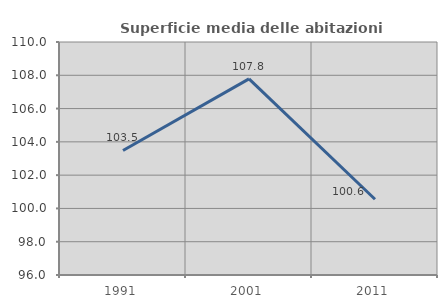
| Category | Superficie media delle abitazioni occupate |
|---|---|
| 1991.0 | 103.481 |
| 2001.0 | 107.787 |
| 2011.0 | 100.553 |